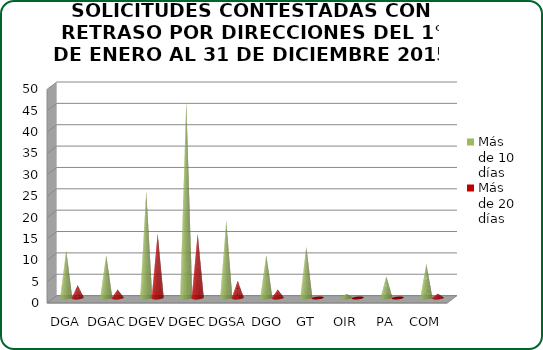
| Category | Más de 10 días | Más de 20 días |
|---|---|---|
| DGA | 11 | 3 |
| DGAC | 10 | 2 |
| DGEV | 25 | 15 |
| DGEC | 46 | 15 |
| DGSA | 18 | 4 |
| DGOA | 10 | 2 |
| GT | 12 | 0 |
| OIR | 1 | 0 |
| PA | 5 | 0 |
| COM | 8 | 1 |